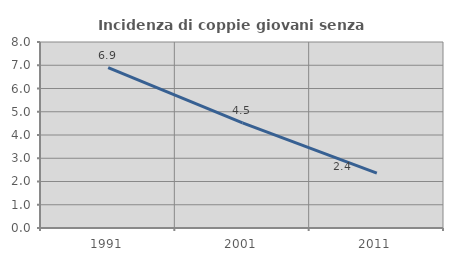
| Category | Incidenza di coppie giovani senza figli |
|---|---|
| 1991.0 | 6.897 |
| 2001.0 | 4.52 |
| 2011.0 | 2.36 |